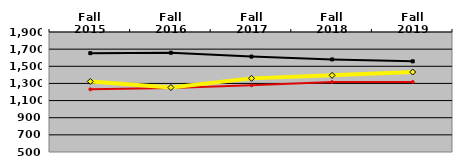
| Category | Series 0 | Series 1 | Series 2 |
|---|---|---|---|
| Fall 2015 | 1653 | 1231 | 1323 |
| Fall 2016 | 1658 | 1245.5 | 1252 |
| Fall 2017 | 1613 | 1278.5 | 1359 |
| Fall 2018 | 1580 | 1316 | 1394 |
| Fall 2019 | 1558 | 1317.5 | 1433 |